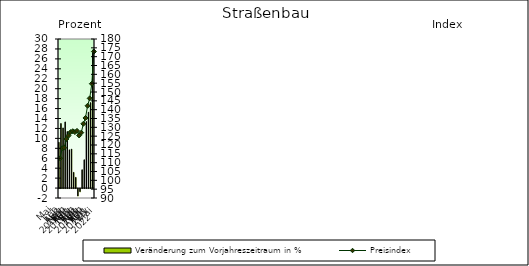
| Category | Veränderung zum Vorjahreszeitraum in % |
|---|---|
| 0 | 9.223 |
| 1 | 13.002 |
| 2 | 12.11 |
| 3 | 13.315 |
| 4 | 11.378 |
| 5 | 7.699 |
| 6 | 7.848 |
| 7 | 3.16 |
| 8 | 2.155 |
| 9 | -1.493 |
| 10 | -0.626 |
| 11 | 3.692 |
| 12 | 5.703 |
| 13 | 13.397 |
| 14 | 15.276 |
| 15 | 17.197 |
| 16 | 27.79 |